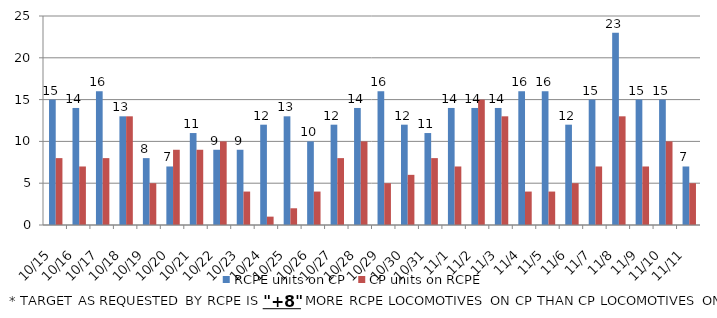
| Category | RCPE units on CP | CP units on RCPE |
|---|---|---|
| 2014-10-15 | 15 | 8 |
| 2014-10-16 | 14 | 7 |
| 2014-10-17 | 16 | 8 |
| 2014-10-18 | 13 | 13 |
| 2014-10-19 | 8 | 5 |
| 2014-10-20 | 7 | 9 |
| 2014-10-21 | 11 | 9 |
| 2014-10-22 | 9 | 10 |
| 2014-10-23 | 9 | 4 |
| 2014-10-24 | 12 | 1 |
| 2014-10-25 | 13 | 2 |
| 2014-10-26 | 10 | 4 |
| 2014-10-27 | 12 | 8 |
| 2014-10-28 | 14 | 10 |
| 2014-10-29 | 16 | 5 |
| 2014-10-30 | 12 | 6 |
| 2014-10-31 | 11 | 8 |
| 2014-11-01 | 14 | 7 |
| 2014-11-02 | 14 | 15 |
| 2014-11-03 | 14 | 13 |
| 2014-11-04 | 16 | 4 |
| 2014-11-05 | 16 | 4 |
| 2014-11-06 | 12 | 5 |
| 2014-11-07 | 15 | 7 |
| 2014-11-08 | 23 | 13 |
| 2014-11-09 | 15 | 7 |
| 2014-11-10 | 15 | 10 |
| 2014-11-11 | 7 | 5 |